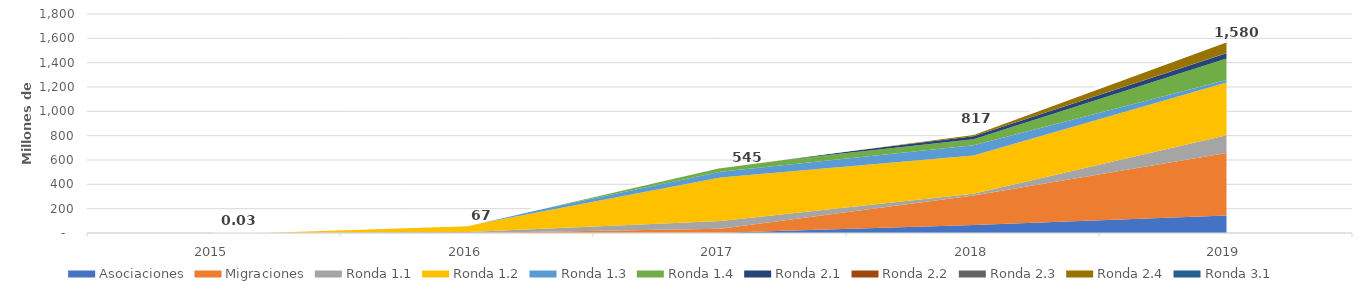
| Category | Series 11 |
|---|---|
| 2015.0 | 0.026 |
| 2016.0 | 67.154 |
| 2017.0 | 545.326 |
| 2018.0 | 817.06 |
| 2019.0 | 1579.57 |